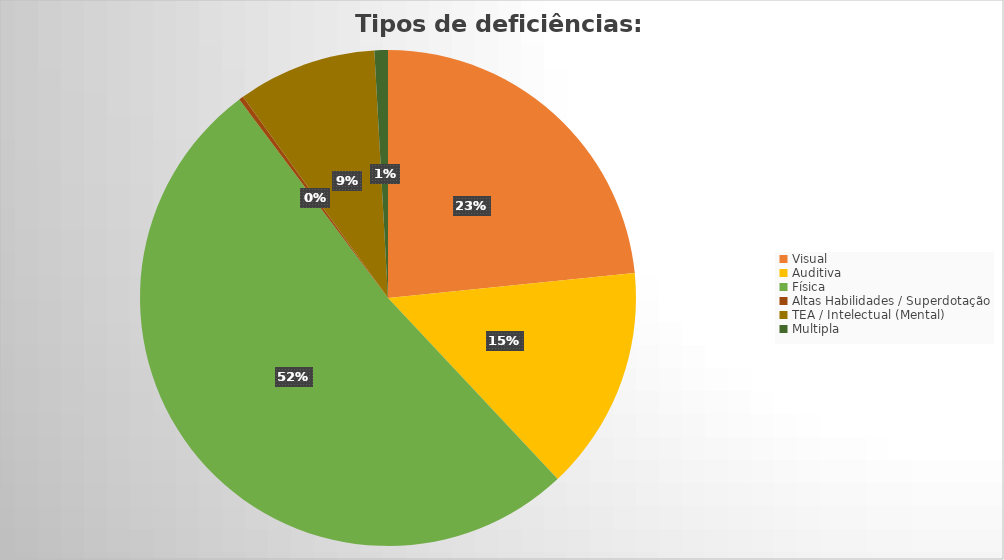
| Category | Tipos de deficiências: Quantitativo |
|---|---|
| Visual | 80 |
| Auditiva | 50 |
| Física | 177 |
| Altas Habilidades / Superdotação  | 1 |
| TEA / Intelectual (Mental) | 31 |
| Multipla | 3 |